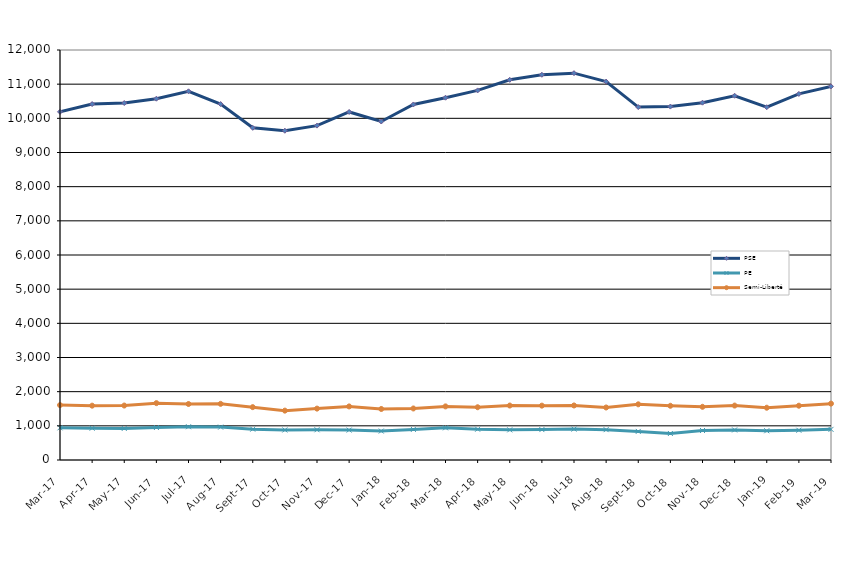
| Category | PSE | PE | Semi-Liberté |
|---|---|---|---|
| 2017-03-01 | 10190 | 942 | 1607 |
| 2017-04-01 | 10417 | 931 | 1590 |
| 2017-05-01 | 10448 | 924 | 1594 |
| 2017-06-01 | 10575 | 951 | 1664 |
| 2017-07-01 | 10791 | 974 | 1639 |
| 2017-08-01 | 10417 | 963 | 1644 |
| 2017-09-01 | 9723 | 903 | 1547 |
| 2017-10-01 | 9637 | 879 | 1445 |
| 2017-11-01 | 9787 | 885 | 1504 |
| 2017-12-01 | 10187 | 876 | 1568 |
| 2018-01-01 | 9907 | 847 | 1493 |
| 2018-02-01 | 10406 | 895 | 1508 |
| 2018-03-01 | 10603 | 942 | 1569 |
| 2018-04-01 | 10817 | 901 | 1544 |
| 2018-05-01 | 11127 | 882 | 1594 |
| 2018-06-01 | 11275 | 890 | 1591 |
| 2018-07-01 | 11322 | 905 | 1596 |
| 2018-08-01 | 11075 | 888 | 1537 |
| 2018-09-01 | 10329 | 837 | 1630 |
| 2018-10-01 | 10344 | 776 | 1587 |
| 2018-11-01 | 10458 | 863 | 1557 |
| 2018-12-01 | 10661 | 880 | 1593 |
| 2019-01-01 | 10325 | 856 | 1530 |
| 2019-02-01 | 10715 | 871 | 1589 |
| 2019-03-01 | 10935 | 897 | 1650 |